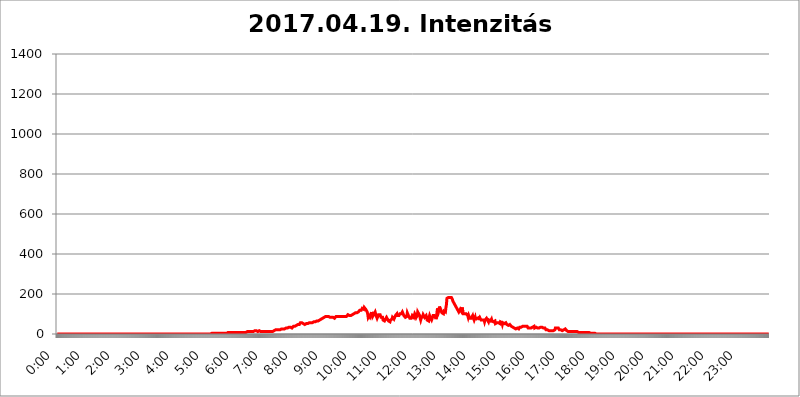
| Category | 2017.04.19. Intenzitás [W/m^2] |
|---|---|
| 0.0 | 0 |
| 0.0006944444444444445 | 0 |
| 0.001388888888888889 | 0 |
| 0.0020833333333333333 | 0 |
| 0.002777777777777778 | 0 |
| 0.003472222222222222 | 0 |
| 0.004166666666666667 | 0 |
| 0.004861111111111111 | 0 |
| 0.005555555555555556 | 0 |
| 0.0062499999999999995 | 0 |
| 0.006944444444444444 | 0 |
| 0.007638888888888889 | 0 |
| 0.008333333333333333 | 0 |
| 0.009027777777777779 | 0 |
| 0.009722222222222222 | 0 |
| 0.010416666666666666 | 0 |
| 0.011111111111111112 | 0 |
| 0.011805555555555555 | 0 |
| 0.012499999999999999 | 0 |
| 0.013194444444444444 | 0 |
| 0.013888888888888888 | 0 |
| 0.014583333333333332 | 0 |
| 0.015277777777777777 | 0 |
| 0.015972222222222224 | 0 |
| 0.016666666666666666 | 0 |
| 0.017361111111111112 | 0 |
| 0.018055555555555557 | 0 |
| 0.01875 | 0 |
| 0.019444444444444445 | 0 |
| 0.02013888888888889 | 0 |
| 0.020833333333333332 | 0 |
| 0.02152777777777778 | 0 |
| 0.022222222222222223 | 0 |
| 0.02291666666666667 | 0 |
| 0.02361111111111111 | 0 |
| 0.024305555555555556 | 0 |
| 0.024999999999999998 | 0 |
| 0.025694444444444447 | 0 |
| 0.02638888888888889 | 0 |
| 0.027083333333333334 | 0 |
| 0.027777777777777776 | 0 |
| 0.02847222222222222 | 0 |
| 0.029166666666666664 | 0 |
| 0.029861111111111113 | 0 |
| 0.030555555555555555 | 0 |
| 0.03125 | 0 |
| 0.03194444444444445 | 0 |
| 0.03263888888888889 | 0 |
| 0.03333333333333333 | 0 |
| 0.034027777777777775 | 0 |
| 0.034722222222222224 | 0 |
| 0.035416666666666666 | 0 |
| 0.036111111111111115 | 0 |
| 0.03680555555555556 | 0 |
| 0.0375 | 0 |
| 0.03819444444444444 | 0 |
| 0.03888888888888889 | 0 |
| 0.03958333333333333 | 0 |
| 0.04027777777777778 | 0 |
| 0.04097222222222222 | 0 |
| 0.041666666666666664 | 0 |
| 0.042361111111111106 | 0 |
| 0.04305555555555556 | 0 |
| 0.043750000000000004 | 0 |
| 0.044444444444444446 | 0 |
| 0.04513888888888889 | 0 |
| 0.04583333333333334 | 0 |
| 0.04652777777777778 | 0 |
| 0.04722222222222222 | 0 |
| 0.04791666666666666 | 0 |
| 0.04861111111111111 | 0 |
| 0.049305555555555554 | 0 |
| 0.049999999999999996 | 0 |
| 0.05069444444444445 | 0 |
| 0.051388888888888894 | 0 |
| 0.052083333333333336 | 0 |
| 0.05277777777777778 | 0 |
| 0.05347222222222222 | 0 |
| 0.05416666666666667 | 0 |
| 0.05486111111111111 | 0 |
| 0.05555555555555555 | 0 |
| 0.05625 | 0 |
| 0.05694444444444444 | 0 |
| 0.057638888888888885 | 0 |
| 0.05833333333333333 | 0 |
| 0.05902777777777778 | 0 |
| 0.059722222222222225 | 0 |
| 0.06041666666666667 | 0 |
| 0.061111111111111116 | 0 |
| 0.06180555555555556 | 0 |
| 0.0625 | 0 |
| 0.06319444444444444 | 0 |
| 0.06388888888888888 | 0 |
| 0.06458333333333334 | 0 |
| 0.06527777777777778 | 0 |
| 0.06597222222222222 | 0 |
| 0.06666666666666667 | 0 |
| 0.06736111111111111 | 0 |
| 0.06805555555555555 | 0 |
| 0.06874999999999999 | 0 |
| 0.06944444444444443 | 0 |
| 0.07013888888888889 | 0 |
| 0.07083333333333333 | 0 |
| 0.07152777777777779 | 0 |
| 0.07222222222222223 | 0 |
| 0.07291666666666667 | 0 |
| 0.07361111111111111 | 0 |
| 0.07430555555555556 | 0 |
| 0.075 | 0 |
| 0.07569444444444444 | 0 |
| 0.0763888888888889 | 0 |
| 0.07708333333333334 | 0 |
| 0.07777777777777778 | 0 |
| 0.07847222222222222 | 0 |
| 0.07916666666666666 | 0 |
| 0.0798611111111111 | 0 |
| 0.08055555555555556 | 0 |
| 0.08125 | 0 |
| 0.08194444444444444 | 0 |
| 0.08263888888888889 | 0 |
| 0.08333333333333333 | 0 |
| 0.08402777777777777 | 0 |
| 0.08472222222222221 | 0 |
| 0.08541666666666665 | 0 |
| 0.08611111111111112 | 0 |
| 0.08680555555555557 | 0 |
| 0.08750000000000001 | 0 |
| 0.08819444444444445 | 0 |
| 0.08888888888888889 | 0 |
| 0.08958333333333333 | 0 |
| 0.09027777777777778 | 0 |
| 0.09097222222222222 | 0 |
| 0.09166666666666667 | 0 |
| 0.09236111111111112 | 0 |
| 0.09305555555555556 | 0 |
| 0.09375 | 0 |
| 0.09444444444444444 | 0 |
| 0.09513888888888888 | 0 |
| 0.09583333333333333 | 0 |
| 0.09652777777777777 | 0 |
| 0.09722222222222222 | 0 |
| 0.09791666666666667 | 0 |
| 0.09861111111111111 | 0 |
| 0.09930555555555555 | 0 |
| 0.09999999999999999 | 0 |
| 0.10069444444444443 | 0 |
| 0.1013888888888889 | 0 |
| 0.10208333333333335 | 0 |
| 0.10277777777777779 | 0 |
| 0.10347222222222223 | 0 |
| 0.10416666666666667 | 0 |
| 0.10486111111111111 | 0 |
| 0.10555555555555556 | 0 |
| 0.10625 | 0 |
| 0.10694444444444444 | 0 |
| 0.1076388888888889 | 0 |
| 0.10833333333333334 | 0 |
| 0.10902777777777778 | 0 |
| 0.10972222222222222 | 0 |
| 0.1111111111111111 | 0 |
| 0.11180555555555556 | 0 |
| 0.11180555555555556 | 0 |
| 0.1125 | 0 |
| 0.11319444444444444 | 0 |
| 0.11388888888888889 | 0 |
| 0.11458333333333333 | 0 |
| 0.11527777777777777 | 0 |
| 0.11597222222222221 | 0 |
| 0.11666666666666665 | 0 |
| 0.1173611111111111 | 0 |
| 0.11805555555555557 | 0 |
| 0.11944444444444445 | 0 |
| 0.12013888888888889 | 0 |
| 0.12083333333333333 | 0 |
| 0.12152777777777778 | 0 |
| 0.12222222222222223 | 0 |
| 0.12291666666666667 | 0 |
| 0.12291666666666667 | 0 |
| 0.12361111111111112 | 0 |
| 0.12430555555555556 | 0 |
| 0.125 | 0 |
| 0.12569444444444444 | 0 |
| 0.12638888888888888 | 0 |
| 0.12708333333333333 | 0 |
| 0.16875 | 0 |
| 0.12847222222222224 | 0 |
| 0.12916666666666668 | 0 |
| 0.12986111111111112 | 0 |
| 0.13055555555555556 | 0 |
| 0.13125 | 0 |
| 0.13194444444444445 | 0 |
| 0.1326388888888889 | 0 |
| 0.13333333333333333 | 0 |
| 0.13402777777777777 | 0 |
| 0.13402777777777777 | 0 |
| 0.13472222222222222 | 0 |
| 0.13541666666666666 | 0 |
| 0.1361111111111111 | 0 |
| 0.13749999999999998 | 0 |
| 0.13819444444444443 | 0 |
| 0.1388888888888889 | 0 |
| 0.13958333333333334 | 0 |
| 0.14027777777777778 | 0 |
| 0.14097222222222222 | 0 |
| 0.14166666666666666 | 0 |
| 0.1423611111111111 | 0 |
| 0.14305555555555557 | 0 |
| 0.14375000000000002 | 0 |
| 0.14444444444444446 | 0 |
| 0.1451388888888889 | 0 |
| 0.1451388888888889 | 0 |
| 0.14652777777777778 | 0 |
| 0.14722222222222223 | 0 |
| 0.14791666666666667 | 0 |
| 0.1486111111111111 | 0 |
| 0.14930555555555555 | 0 |
| 0.15 | 0 |
| 0.15069444444444444 | 0 |
| 0.15138888888888888 | 0 |
| 0.15208333333333332 | 0 |
| 0.15277777777777776 | 0 |
| 0.15347222222222223 | 0 |
| 0.15416666666666667 | 0 |
| 0.15486111111111112 | 0 |
| 0.15555555555555556 | 0 |
| 0.15625 | 0 |
| 0.15694444444444444 | 0 |
| 0.15763888888888888 | 0 |
| 0.15833333333333333 | 0 |
| 0.15902777777777777 | 0 |
| 0.15972222222222224 | 0 |
| 0.16041666666666668 | 0 |
| 0.16111111111111112 | 0 |
| 0.16180555555555556 | 0 |
| 0.1625 | 0 |
| 0.16319444444444445 | 0 |
| 0.1638888888888889 | 0 |
| 0.16458333333333333 | 0 |
| 0.16527777777777777 | 0 |
| 0.16597222222222222 | 0 |
| 0.16666666666666666 | 0 |
| 0.1673611111111111 | 0 |
| 0.16805555555555554 | 0 |
| 0.16874999999999998 | 0 |
| 0.16944444444444443 | 0 |
| 0.17013888888888887 | 0 |
| 0.1708333333333333 | 0 |
| 0.17152777777777775 | 0 |
| 0.17222222222222225 | 0 |
| 0.1729166666666667 | 0 |
| 0.17361111111111113 | 0 |
| 0.17430555555555557 | 0 |
| 0.17500000000000002 | 0 |
| 0.17569444444444446 | 0 |
| 0.1763888888888889 | 0 |
| 0.17708333333333334 | 0 |
| 0.17777777777777778 | 0 |
| 0.17847222222222223 | 0 |
| 0.17916666666666667 | 0 |
| 0.1798611111111111 | 0 |
| 0.18055555555555555 | 0 |
| 0.18125 | 0 |
| 0.18194444444444444 | 0 |
| 0.1826388888888889 | 0 |
| 0.18333333333333335 | 0 |
| 0.1840277777777778 | 0 |
| 0.18472222222222223 | 0 |
| 0.18541666666666667 | 0 |
| 0.18611111111111112 | 0 |
| 0.18680555555555556 | 0 |
| 0.1875 | 0 |
| 0.18819444444444444 | 0 |
| 0.18888888888888888 | 0 |
| 0.18958333333333333 | 0 |
| 0.19027777777777777 | 0 |
| 0.1909722222222222 | 0 |
| 0.19166666666666665 | 0 |
| 0.19236111111111112 | 0 |
| 0.19305555555555554 | 0 |
| 0.19375 | 0 |
| 0.19444444444444445 | 0 |
| 0.1951388888888889 | 0 |
| 0.19583333333333333 | 0 |
| 0.19652777777777777 | 0 |
| 0.19722222222222222 | 0 |
| 0.19791666666666666 | 0 |
| 0.1986111111111111 | 0 |
| 0.19930555555555554 | 0 |
| 0.19999999999999998 | 0 |
| 0.20069444444444443 | 0 |
| 0.20138888888888887 | 0 |
| 0.2020833333333333 | 0 |
| 0.2027777777777778 | 0 |
| 0.2034722222222222 | 0 |
| 0.2041666666666667 | 0 |
| 0.20486111111111113 | 0 |
| 0.20555555555555557 | 0 |
| 0.20625000000000002 | 0 |
| 0.20694444444444446 | 0 |
| 0.2076388888888889 | 0 |
| 0.20833333333333334 | 0 |
| 0.20902777777777778 | 0 |
| 0.20972222222222223 | 0 |
| 0.21041666666666667 | 0 |
| 0.2111111111111111 | 0 |
| 0.21180555555555555 | 0 |
| 0.2125 | 0 |
| 0.21319444444444444 | 0 |
| 0.2138888888888889 | 0 |
| 0.21458333333333335 | 0 |
| 0.2152777777777778 | 0 |
| 0.21597222222222223 | 0 |
| 0.21666666666666667 | 3.525 |
| 0.21736111111111112 | 3.525 |
| 0.21805555555555556 | 3.525 |
| 0.21875 | 3.525 |
| 0.21944444444444444 | 3.525 |
| 0.22013888888888888 | 3.525 |
| 0.22083333333333333 | 3.525 |
| 0.22152777777777777 | 3.525 |
| 0.2222222222222222 | 3.525 |
| 0.22291666666666665 | 3.525 |
| 0.2236111111111111 | 3.525 |
| 0.22430555555555556 | 3.525 |
| 0.225 | 3.525 |
| 0.22569444444444445 | 3.525 |
| 0.2263888888888889 | 3.525 |
| 0.22708333333333333 | 3.525 |
| 0.22777777777777777 | 3.525 |
| 0.22847222222222222 | 3.525 |
| 0.22916666666666666 | 3.525 |
| 0.2298611111111111 | 3.525 |
| 0.23055555555555554 | 3.525 |
| 0.23124999999999998 | 3.525 |
| 0.23194444444444443 | 3.525 |
| 0.23263888888888887 | 3.525 |
| 0.2333333333333333 | 3.525 |
| 0.2340277777777778 | 3.525 |
| 0.2347222222222222 | 3.525 |
| 0.2354166666666667 | 3.525 |
| 0.23611111111111113 | 3.525 |
| 0.23680555555555557 | 3.525 |
| 0.23750000000000002 | 3.525 |
| 0.23819444444444446 | 7.887 |
| 0.2388888888888889 | 3.525 |
| 0.23958333333333334 | 7.887 |
| 0.24027777777777778 | 7.887 |
| 0.24097222222222223 | 7.887 |
| 0.24166666666666667 | 7.887 |
| 0.2423611111111111 | 7.887 |
| 0.24305555555555555 | 7.887 |
| 0.24375 | 7.887 |
| 0.24444444444444446 | 7.887 |
| 0.24513888888888888 | 7.887 |
| 0.24583333333333335 | 7.887 |
| 0.2465277777777778 | 7.887 |
| 0.24722222222222223 | 7.887 |
| 0.24791666666666667 | 7.887 |
| 0.24861111111111112 | 7.887 |
| 0.24930555555555556 | 3.525 |
| 0.25 | 7.887 |
| 0.25069444444444444 | 7.887 |
| 0.2513888888888889 | 7.887 |
| 0.2520833333333333 | 7.887 |
| 0.25277777777777777 | 7.887 |
| 0.2534722222222222 | 7.887 |
| 0.25416666666666665 | 7.887 |
| 0.2548611111111111 | 7.887 |
| 0.2555555555555556 | 7.887 |
| 0.25625000000000003 | 7.887 |
| 0.2569444444444445 | 7.887 |
| 0.2576388888888889 | 7.887 |
| 0.25833333333333336 | 7.887 |
| 0.2590277777777778 | 12.257 |
| 0.25972222222222224 | 12.257 |
| 0.2604166666666667 | 7.887 |
| 0.2611111111111111 | 12.257 |
| 0.26180555555555557 | 7.887 |
| 0.2625 | 7.887 |
| 0.26319444444444445 | 7.887 |
| 0.2638888888888889 | 7.887 |
| 0.26458333333333334 | 7.887 |
| 0.2652777777777778 | 7.887 |
| 0.2659722222222222 | 7.887 |
| 0.26666666666666666 | 12.257 |
| 0.2673611111111111 | 12.257 |
| 0.26805555555555555 | 12.257 |
| 0.26875 | 12.257 |
| 0.26944444444444443 | 12.257 |
| 0.2701388888888889 | 12.257 |
| 0.2708333333333333 | 12.257 |
| 0.27152777777777776 | 12.257 |
| 0.2722222222222222 | 12.257 |
| 0.27291666666666664 | 12.257 |
| 0.2736111111111111 | 12.257 |
| 0.2743055555555555 | 12.257 |
| 0.27499999999999997 | 12.257 |
| 0.27569444444444446 | 12.257 |
| 0.27638888888888885 | 12.257 |
| 0.27708333333333335 | 16.636 |
| 0.2777777777777778 | 12.257 |
| 0.27847222222222223 | 16.636 |
| 0.2791666666666667 | 16.636 |
| 0.2798611111111111 | 16.636 |
| 0.28055555555555556 | 16.636 |
| 0.28125 | 12.257 |
| 0.28194444444444444 | 16.636 |
| 0.2826388888888889 | 12.257 |
| 0.2833333333333333 | 16.636 |
| 0.28402777777777777 | 16.636 |
| 0.2847222222222222 | 12.257 |
| 0.28541666666666665 | 12.257 |
| 0.28611111111111115 | 12.257 |
| 0.28680555555555554 | 12.257 |
| 0.28750000000000003 | 12.257 |
| 0.2881944444444445 | 12.257 |
| 0.2888888888888889 | 12.257 |
| 0.28958333333333336 | 12.257 |
| 0.2902777777777778 | 12.257 |
| 0.29097222222222224 | 12.257 |
| 0.2916666666666667 | 12.257 |
| 0.2923611111111111 | 12.257 |
| 0.29305555555555557 | 12.257 |
| 0.29375 | 12.257 |
| 0.29444444444444445 | 12.257 |
| 0.2951388888888889 | 12.257 |
| 0.29583333333333334 | 12.257 |
| 0.2965277777777778 | 12.257 |
| 0.2972222222222222 | 12.257 |
| 0.29791666666666666 | 12.257 |
| 0.2986111111111111 | 12.257 |
| 0.29930555555555555 | 12.257 |
| 0.3 | 12.257 |
| 0.30069444444444443 | 12.257 |
| 0.3013888888888889 | 12.257 |
| 0.3020833333333333 | 12.257 |
| 0.30277777777777776 | 12.257 |
| 0.3034722222222222 | 12.257 |
| 0.30416666666666664 | 16.636 |
| 0.3048611111111111 | 16.636 |
| 0.3055555555555555 | 16.636 |
| 0.30624999999999997 | 21.024 |
| 0.3069444444444444 | 21.024 |
| 0.3076388888888889 | 21.024 |
| 0.30833333333333335 | 21.024 |
| 0.3090277777777778 | 21.024 |
| 0.30972222222222223 | 21.024 |
| 0.3104166666666667 | 21.024 |
| 0.3111111111111111 | 21.024 |
| 0.31180555555555556 | 21.024 |
| 0.3125 | 21.024 |
| 0.31319444444444444 | 21.024 |
| 0.3138888888888889 | 21.024 |
| 0.3145833333333333 | 25.419 |
| 0.31527777777777777 | 25.419 |
| 0.3159722222222222 | 25.419 |
| 0.31666666666666665 | 25.419 |
| 0.31736111111111115 | 25.419 |
| 0.31805555555555554 | 25.419 |
| 0.31875000000000003 | 25.419 |
| 0.3194444444444445 | 29.823 |
| 0.3201388888888889 | 29.823 |
| 0.32083333333333336 | 29.823 |
| 0.3215277777777778 | 29.823 |
| 0.32222222222222224 | 29.823 |
| 0.3229166666666667 | 29.823 |
| 0.3236111111111111 | 29.823 |
| 0.32430555555555557 | 34.234 |
| 0.325 | 34.234 |
| 0.32569444444444445 | 34.234 |
| 0.3263888888888889 | 34.234 |
| 0.32708333333333334 | 34.234 |
| 0.3277777777777778 | 34.234 |
| 0.3284722222222222 | 34.234 |
| 0.32916666666666666 | 29.823 |
| 0.3298611111111111 | 34.234 |
| 0.33055555555555555 | 34.234 |
| 0.33125 | 38.653 |
| 0.33194444444444443 | 38.653 |
| 0.3326388888888889 | 38.653 |
| 0.3333333333333333 | 38.653 |
| 0.3340277777777778 | 38.653 |
| 0.3347222222222222 | 43.079 |
| 0.3354166666666667 | 43.079 |
| 0.3361111111111111 | 43.079 |
| 0.3368055555555556 | 47.511 |
| 0.33749999999999997 | 47.511 |
| 0.33819444444444446 | 47.511 |
| 0.33888888888888885 | 47.511 |
| 0.33958333333333335 | 47.511 |
| 0.34027777777777773 | 51.951 |
| 0.34097222222222223 | 56.398 |
| 0.3416666666666666 | 51.951 |
| 0.3423611111111111 | 56.398 |
| 0.3430555555555555 | 56.398 |
| 0.34375 | 51.951 |
| 0.3444444444444445 | 51.951 |
| 0.3451388888888889 | 51.951 |
| 0.3458333333333334 | 56.398 |
| 0.34652777777777777 | 47.511 |
| 0.34722222222222227 | 47.511 |
| 0.34791666666666665 | 51.951 |
| 0.34861111111111115 | 51.951 |
| 0.34930555555555554 | 51.951 |
| 0.35000000000000003 | 56.398 |
| 0.3506944444444444 | 51.951 |
| 0.3513888888888889 | 51.951 |
| 0.3520833333333333 | 56.398 |
| 0.3527777777777778 | 51.951 |
| 0.3534722222222222 | 56.398 |
| 0.3541666666666667 | 56.398 |
| 0.3548611111111111 | 51.951 |
| 0.35555555555555557 | 56.398 |
| 0.35625 | 56.398 |
| 0.35694444444444445 | 51.951 |
| 0.3576388888888889 | 56.398 |
| 0.35833333333333334 | 56.398 |
| 0.3590277777777778 | 60.85 |
| 0.3597222222222222 | 60.85 |
| 0.36041666666666666 | 60.85 |
| 0.3611111111111111 | 65.31 |
| 0.36180555555555555 | 60.85 |
| 0.3625 | 60.85 |
| 0.36319444444444443 | 65.31 |
| 0.3638888888888889 | 65.31 |
| 0.3645833333333333 | 60.85 |
| 0.3652777777777778 | 65.31 |
| 0.3659722222222222 | 65.31 |
| 0.3666666666666667 | 65.31 |
| 0.3673611111111111 | 65.31 |
| 0.3680555555555556 | 69.775 |
| 0.36874999999999997 | 69.775 |
| 0.36944444444444446 | 74.246 |
| 0.37013888888888885 | 74.246 |
| 0.37083333333333335 | 74.246 |
| 0.37152777777777773 | 74.246 |
| 0.37222222222222223 | 78.722 |
| 0.3729166666666666 | 78.722 |
| 0.3736111111111111 | 78.722 |
| 0.3743055555555555 | 83.205 |
| 0.375 | 78.722 |
| 0.3756944444444445 | 83.205 |
| 0.3763888888888889 | 87.692 |
| 0.3770833333333334 | 87.692 |
| 0.37777777777777777 | 83.205 |
| 0.37847222222222227 | 87.692 |
| 0.37916666666666665 | 83.205 |
| 0.37986111111111115 | 83.205 |
| 0.38055555555555554 | 87.692 |
| 0.38125000000000003 | 87.692 |
| 0.3819444444444444 | 87.692 |
| 0.3826388888888889 | 83.205 |
| 0.3833333333333333 | 83.205 |
| 0.3840277777777778 | 83.205 |
| 0.3847222222222222 | 83.205 |
| 0.3854166666666667 | 83.205 |
| 0.3861111111111111 | 83.205 |
| 0.38680555555555557 | 83.205 |
| 0.3875 | 83.205 |
| 0.38819444444444445 | 83.205 |
| 0.3888888888888889 | 78.722 |
| 0.38958333333333334 | 83.205 |
| 0.3902777777777778 | 83.205 |
| 0.3909722222222222 | 87.692 |
| 0.39166666666666666 | 87.692 |
| 0.3923611111111111 | 87.692 |
| 0.39305555555555555 | 87.692 |
| 0.39375 | 92.184 |
| 0.39444444444444443 | 87.692 |
| 0.3951388888888889 | 87.692 |
| 0.3958333333333333 | 87.692 |
| 0.3965277777777778 | 87.692 |
| 0.3972222222222222 | 87.692 |
| 0.3979166666666667 | 83.205 |
| 0.3986111111111111 | 83.205 |
| 0.3993055555555556 | 87.692 |
| 0.39999999999999997 | 87.692 |
| 0.40069444444444446 | 87.692 |
| 0.40138888888888885 | 87.692 |
| 0.40208333333333335 | 87.692 |
| 0.40277777777777773 | 87.692 |
| 0.40347222222222223 | 87.692 |
| 0.4041666666666666 | 87.692 |
| 0.4048611111111111 | 87.692 |
| 0.4055555555555555 | 87.692 |
| 0.40625 | 92.184 |
| 0.4069444444444445 | 92.184 |
| 0.4076388888888889 | 96.682 |
| 0.4083333333333334 | 92.184 |
| 0.40902777777777777 | 92.184 |
| 0.40972222222222227 | 92.184 |
| 0.41041666666666665 | 92.184 |
| 0.41111111111111115 | 92.184 |
| 0.41180555555555554 | 92.184 |
| 0.41250000000000003 | 92.184 |
| 0.4131944444444444 | 92.184 |
| 0.4138888888888889 | 96.682 |
| 0.4145833333333333 | 101.184 |
| 0.4152777777777778 | 96.682 |
| 0.4159722222222222 | 101.184 |
| 0.4166666666666667 | 105.69 |
| 0.4173611111111111 | 105.69 |
| 0.41805555555555557 | 105.69 |
| 0.41875 | 101.184 |
| 0.41944444444444445 | 105.69 |
| 0.4201388888888889 | 105.69 |
| 0.42083333333333334 | 110.201 |
| 0.4215277777777778 | 110.201 |
| 0.4222222222222222 | 110.201 |
| 0.42291666666666666 | 110.201 |
| 0.4236111111111111 | 110.201 |
| 0.42430555555555555 | 119.235 |
| 0.425 | 123.758 |
| 0.42569444444444443 | 114.716 |
| 0.4263888888888889 | 119.235 |
| 0.4270833333333333 | 123.758 |
| 0.4277777777777778 | 128.284 |
| 0.4284722222222222 | 128.284 |
| 0.4291666666666667 | 123.758 |
| 0.4298611111111111 | 123.758 |
| 0.4305555555555556 | 132.814 |
| 0.43124999999999997 | 128.284 |
| 0.43194444444444446 | 128.284 |
| 0.43263888888888885 | 123.758 |
| 0.43333333333333335 | 119.235 |
| 0.43402777777777773 | 119.235 |
| 0.43472222222222223 | 110.201 |
| 0.4354166666666666 | 101.184 |
| 0.4361111111111111 | 83.205 |
| 0.4368055555555555 | 83.205 |
| 0.4375 | 92.184 |
| 0.4381944444444445 | 92.184 |
| 0.4388888888888889 | 83.205 |
| 0.4395833333333334 | 83.205 |
| 0.44027777777777777 | 92.184 |
| 0.44097222222222227 | 110.201 |
| 0.44166666666666665 | 101.184 |
| 0.44236111111111115 | 87.692 |
| 0.44305555555555554 | 87.692 |
| 0.44375000000000003 | 92.184 |
| 0.4444444444444444 | 101.184 |
| 0.4451388888888889 | 105.69 |
| 0.4458333333333333 | 110.201 |
| 0.4465277777777778 | 110.201 |
| 0.4472222222222222 | 92.184 |
| 0.4479166666666667 | 87.692 |
| 0.4486111111111111 | 78.722 |
| 0.44930555555555557 | 78.722 |
| 0.45 | 83.205 |
| 0.45069444444444445 | 96.682 |
| 0.4513888888888889 | 101.184 |
| 0.45208333333333334 | 101.184 |
| 0.4527777777777778 | 96.682 |
| 0.4534722222222222 | 96.682 |
| 0.45416666666666666 | 83.205 |
| 0.4548611111111111 | 78.722 |
| 0.45555555555555555 | 78.722 |
| 0.45625 | 83.205 |
| 0.45694444444444443 | 69.775 |
| 0.4576388888888889 | 65.31 |
| 0.4583333333333333 | 65.31 |
| 0.4590277777777778 | 65.31 |
| 0.4597222222222222 | 65.31 |
| 0.4604166666666667 | 74.246 |
| 0.4611111111111111 | 78.722 |
| 0.4618055555555556 | 83.205 |
| 0.46249999999999997 | 83.205 |
| 0.46319444444444446 | 74.246 |
| 0.46388888888888885 | 69.775 |
| 0.46458333333333335 | 65.31 |
| 0.46527777777777773 | 65.31 |
| 0.46597222222222223 | 65.31 |
| 0.4666666666666666 | 60.85 |
| 0.4673611111111111 | 69.775 |
| 0.4680555555555555 | 65.31 |
| 0.46875 | 69.775 |
| 0.4694444444444445 | 74.246 |
| 0.4701388888888889 | 83.205 |
| 0.4708333333333334 | 78.722 |
| 0.47152777777777777 | 78.722 |
| 0.47222222222222227 | 74.246 |
| 0.47291666666666665 | 78.722 |
| 0.47361111111111115 | 78.722 |
| 0.47430555555555554 | 92.184 |
| 0.47500000000000003 | 92.184 |
| 0.4756944444444444 | 96.682 |
| 0.4763888888888889 | 101.184 |
| 0.4770833333333333 | 92.184 |
| 0.4777777777777778 | 96.682 |
| 0.4784722222222222 | 87.692 |
| 0.4791666666666667 | 92.184 |
| 0.4798611111111111 | 96.682 |
| 0.48055555555555557 | 101.184 |
| 0.48125 | 101.184 |
| 0.48194444444444445 | 101.184 |
| 0.4826388888888889 | 101.184 |
| 0.48333333333333334 | 101.184 |
| 0.4840277777777778 | 110.201 |
| 0.4847222222222222 | 105.69 |
| 0.48541666666666666 | 105.69 |
| 0.4861111111111111 | 92.184 |
| 0.48680555555555555 | 87.692 |
| 0.4875 | 87.692 |
| 0.48819444444444443 | 83.205 |
| 0.4888888888888889 | 83.205 |
| 0.4895833333333333 | 83.205 |
| 0.4902777777777778 | 87.692 |
| 0.4909722222222222 | 105.69 |
| 0.4916666666666667 | 105.69 |
| 0.4923611111111111 | 101.184 |
| 0.4930555555555556 | 87.692 |
| 0.49374999999999997 | 83.205 |
| 0.49444444444444446 | 78.722 |
| 0.49513888888888885 | 78.722 |
| 0.49583333333333335 | 83.205 |
| 0.49652777777777773 | 78.722 |
| 0.49722222222222223 | 74.246 |
| 0.4979166666666666 | 92.184 |
| 0.4986111111111111 | 96.682 |
| 0.4993055555555555 | 92.184 |
| 0.5 | 83.205 |
| 0.5006944444444444 | 92.184 |
| 0.5013888888888889 | 101.184 |
| 0.5020833333333333 | 96.682 |
| 0.5027777777777778 | 92.184 |
| 0.5034722222222222 | 83.205 |
| 0.5041666666666667 | 83.205 |
| 0.5048611111111111 | 92.184 |
| 0.5055555555555555 | 110.201 |
| 0.50625 | 110.201 |
| 0.5069444444444444 | 101.184 |
| 0.5076388888888889 | 101.184 |
| 0.5083333333333333 | 92.184 |
| 0.5090277777777777 | 78.722 |
| 0.5097222222222222 | 69.775 |
| 0.5104166666666666 | 78.722 |
| 0.5111111111111112 | 74.246 |
| 0.5118055555555555 | 83.205 |
| 0.5125000000000001 | 87.692 |
| 0.5131944444444444 | 96.682 |
| 0.513888888888889 | 92.184 |
| 0.5145833333333333 | 92.184 |
| 0.5152777777777778 | 83.205 |
| 0.5159722222222222 | 87.692 |
| 0.5166666666666667 | 83.205 |
| 0.517361111111111 | 92.184 |
| 0.5180555555555556 | 83.205 |
| 0.5187499999999999 | 69.775 |
| 0.5194444444444445 | 74.246 |
| 0.5201388888888888 | 74.246 |
| 0.5208333333333334 | 65.31 |
| 0.5215277777777778 | 83.205 |
| 0.5222222222222223 | 92.184 |
| 0.5229166666666667 | 87.692 |
| 0.5236111111111111 | 78.722 |
| 0.5243055555555556 | 74.246 |
| 0.525 | 69.775 |
| 0.5256944444444445 | 65.31 |
| 0.5263888888888889 | 83.205 |
| 0.5270833333333333 | 92.184 |
| 0.5277777777777778 | 92.184 |
| 0.5284722222222222 | 96.682 |
| 0.5291666666666667 | 92.184 |
| 0.5298611111111111 | 96.682 |
| 0.5305555555555556 | 83.205 |
| 0.53125 | 74.246 |
| 0.5319444444444444 | 87.692 |
| 0.5326388888888889 | 110.201 |
| 0.5333333333333333 | 128.284 |
| 0.5340277777777778 | 119.235 |
| 0.5347222222222222 | 110.201 |
| 0.5354166666666667 | 119.235 |
| 0.5361111111111111 | 137.347 |
| 0.5368055555555555 | 141.884 |
| 0.5375 | 132.814 |
| 0.5381944444444444 | 114.716 |
| 0.5388888888888889 | 110.201 |
| 0.5395833333333333 | 105.69 |
| 0.5402777777777777 | 110.201 |
| 0.5409722222222222 | 110.201 |
| 0.5416666666666666 | 101.184 |
| 0.5423611111111112 | 114.716 |
| 0.5430555555555555 | 119.235 |
| 0.5437500000000001 | 114.716 |
| 0.5444444444444444 | 110.201 |
| 0.545138888888889 | 132.814 |
| 0.5458333333333333 | 146.423 |
| 0.5465277777777778 | 178.264 |
| 0.5472222222222222 | 182.82 |
| 0.5479166666666667 | 182.82 |
| 0.548611111111111 | 182.82 |
| 0.5493055555555556 | 182.82 |
| 0.5499999999999999 | 182.82 |
| 0.5506944444444445 | 182.82 |
| 0.5513888888888888 | 182.82 |
| 0.5520833333333334 | 182.82 |
| 0.5527777777777778 | 182.82 |
| 0.5534722222222223 | 182.82 |
| 0.5541666666666667 | 173.709 |
| 0.5548611111111111 | 164.605 |
| 0.5555555555555556 | 160.056 |
| 0.55625 | 155.509 |
| 0.5569444444444445 | 150.964 |
| 0.5576388888888889 | 146.423 |
| 0.5583333333333333 | 141.884 |
| 0.5590277777777778 | 137.347 |
| 0.5597222222222222 | 132.814 |
| 0.5604166666666667 | 128.284 |
| 0.5611111111111111 | 123.758 |
| 0.5618055555555556 | 119.235 |
| 0.5625 | 114.716 |
| 0.5631944444444444 | 110.201 |
| 0.5638888888888889 | 105.69 |
| 0.5645833333333333 | 110.201 |
| 0.5652777777777778 | 123.758 |
| 0.5659722222222222 | 123.758 |
| 0.5666666666666667 | 114.716 |
| 0.5673611111111111 | 114.716 |
| 0.5680555555555555 | 132.814 |
| 0.56875 | 114.716 |
| 0.5694444444444444 | 101.184 |
| 0.5701388888888889 | 105.69 |
| 0.5708333333333333 | 96.682 |
| 0.5715277777777777 | 101.184 |
| 0.5722222222222222 | 101.184 |
| 0.5729166666666666 | 101.184 |
| 0.5736111111111112 | 101.184 |
| 0.5743055555555555 | 105.69 |
| 0.5750000000000001 | 101.184 |
| 0.5756944444444444 | 92.184 |
| 0.576388888888889 | 83.205 |
| 0.5770833333333333 | 92.184 |
| 0.5777777777777778 | 92.184 |
| 0.5784722222222222 | 78.722 |
| 0.5791666666666667 | 83.205 |
| 0.579861111111111 | 78.722 |
| 0.5805555555555556 | 78.722 |
| 0.5812499999999999 | 78.722 |
| 0.5819444444444445 | 83.205 |
| 0.5826388888888888 | 92.184 |
| 0.5833333333333334 | 83.205 |
| 0.5840277777777778 | 78.722 |
| 0.5847222222222223 | 69.775 |
| 0.5854166666666667 | 65.31 |
| 0.5861111111111111 | 83.205 |
| 0.5868055555555556 | 69.775 |
| 0.5875 | 78.722 |
| 0.5881944444444445 | 78.722 |
| 0.5888888888888889 | 83.205 |
| 0.5895833333333333 | 78.722 |
| 0.5902777777777778 | 83.205 |
| 0.5909722222222222 | 78.722 |
| 0.5916666666666667 | 83.205 |
| 0.5923611111111111 | 69.775 |
| 0.5930555555555556 | 78.722 |
| 0.59375 | 83.205 |
| 0.5944444444444444 | 69.775 |
| 0.5951388888888889 | 65.31 |
| 0.5958333333333333 | 74.246 |
| 0.5965277777777778 | 69.775 |
| 0.5972222222222222 | 69.775 |
| 0.5979166666666667 | 74.246 |
| 0.5986111111111111 | 69.775 |
| 0.5993055555555555 | 60.85 |
| 0.6 | 69.775 |
| 0.6006944444444444 | 69.775 |
| 0.6013888888888889 | 74.246 |
| 0.6020833333333333 | 78.722 |
| 0.6027777777777777 | 74.246 |
| 0.6034722222222222 | 69.775 |
| 0.6041666666666666 | 65.31 |
| 0.6048611111111112 | 60.85 |
| 0.6055555555555555 | 69.775 |
| 0.6062500000000001 | 74.246 |
| 0.6069444444444444 | 74.246 |
| 0.607638888888889 | 65.31 |
| 0.6083333333333333 | 60.85 |
| 0.6090277777777778 | 74.246 |
| 0.6097222222222222 | 65.31 |
| 0.6104166666666667 | 60.85 |
| 0.611111111111111 | 60.85 |
| 0.6118055555555556 | 60.85 |
| 0.6124999999999999 | 56.398 |
| 0.6131944444444445 | 60.85 |
| 0.6138888888888888 | 65.31 |
| 0.6145833333333334 | 51.951 |
| 0.6152777777777778 | 56.398 |
| 0.6159722222222223 | 56.398 |
| 0.6166666666666667 | 56.398 |
| 0.6173611111111111 | 56.398 |
| 0.6180555555555556 | 51.951 |
| 0.61875 | 56.398 |
| 0.6194444444444445 | 56.398 |
| 0.6201388888888889 | 56.398 |
| 0.6208333333333333 | 51.951 |
| 0.6215277777777778 | 60.85 |
| 0.6222222222222222 | 56.398 |
| 0.6229166666666667 | 56.398 |
| 0.6236111111111111 | 56.398 |
| 0.6243055555555556 | 47.511 |
| 0.625 | 56.398 |
| 0.6256944444444444 | 56.398 |
| 0.6263888888888889 | 51.951 |
| 0.6270833333333333 | 51.951 |
| 0.6277777777777778 | 56.398 |
| 0.6284722222222222 | 51.951 |
| 0.6291666666666667 | 56.398 |
| 0.6298611111111111 | 56.398 |
| 0.6305555555555555 | 47.511 |
| 0.63125 | 51.951 |
| 0.6319444444444444 | 51.951 |
| 0.6326388888888889 | 43.079 |
| 0.6333333333333333 | 43.079 |
| 0.6340277777777777 | 47.511 |
| 0.6347222222222222 | 47.511 |
| 0.6354166666666666 | 47.511 |
| 0.6361111111111112 | 47.511 |
| 0.6368055555555555 | 38.653 |
| 0.6375000000000001 | 34.234 |
| 0.6381944444444444 | 38.653 |
| 0.638888888888889 | 34.234 |
| 0.6395833333333333 | 34.234 |
| 0.6402777777777778 | 38.653 |
| 0.6409722222222222 | 29.823 |
| 0.6416666666666667 | 29.823 |
| 0.642361111111111 | 29.823 |
| 0.6430555555555556 | 25.419 |
| 0.6437499999999999 | 25.419 |
| 0.6444444444444445 | 29.823 |
| 0.6451388888888888 | 29.823 |
| 0.6458333333333334 | 29.823 |
| 0.6465277777777778 | 34.234 |
| 0.6472222222222223 | 25.419 |
| 0.6479166666666667 | 29.823 |
| 0.6486111111111111 | 34.234 |
| 0.6493055555555556 | 34.234 |
| 0.65 | 34.234 |
| 0.6506944444444445 | 34.234 |
| 0.6513888888888889 | 38.653 |
| 0.6520833333333333 | 34.234 |
| 0.6527777777777778 | 38.653 |
| 0.6534722222222222 | 34.234 |
| 0.6541666666666667 | 38.653 |
| 0.6548611111111111 | 38.653 |
| 0.6555555555555556 | 34.234 |
| 0.65625 | 34.234 |
| 0.6569444444444444 | 38.653 |
| 0.6576388888888889 | 38.653 |
| 0.6583333333333333 | 38.653 |
| 0.6590277777777778 | 38.653 |
| 0.6597222222222222 | 34.234 |
| 0.6604166666666667 | 29.823 |
| 0.6611111111111111 | 34.234 |
| 0.6618055555555555 | 34.234 |
| 0.6625 | 29.823 |
| 0.6631944444444444 | 29.823 |
| 0.6638888888888889 | 34.234 |
| 0.6645833333333333 | 29.823 |
| 0.6652777777777777 | 29.823 |
| 0.6659722222222222 | 29.823 |
| 0.6666666666666666 | 34.234 |
| 0.6673611111111111 | 34.234 |
| 0.6680555555555556 | 38.653 |
| 0.6687500000000001 | 38.653 |
| 0.6694444444444444 | 29.823 |
| 0.6701388888888888 | 34.234 |
| 0.6708333333333334 | 34.234 |
| 0.6715277777777778 | 34.234 |
| 0.6722222222222222 | 29.823 |
| 0.6729166666666666 | 29.823 |
| 0.6736111111111112 | 29.823 |
| 0.6743055555555556 | 29.823 |
| 0.6749999999999999 | 29.823 |
| 0.6756944444444444 | 29.823 |
| 0.6763888888888889 | 34.234 |
| 0.6770833333333334 | 34.234 |
| 0.6777777777777777 | 34.234 |
| 0.6784722222222223 | 34.234 |
| 0.6791666666666667 | 34.234 |
| 0.6798611111111111 | 34.234 |
| 0.6805555555555555 | 34.234 |
| 0.68125 | 29.823 |
| 0.6819444444444445 | 29.823 |
| 0.6826388888888889 | 29.823 |
| 0.6833333333333332 | 29.823 |
| 0.6840277777777778 | 29.823 |
| 0.6847222222222222 | 25.419 |
| 0.6854166666666667 | 21.024 |
| 0.686111111111111 | 25.419 |
| 0.6868055555555556 | 21.024 |
| 0.6875 | 21.024 |
| 0.6881944444444444 | 21.024 |
| 0.688888888888889 | 21.024 |
| 0.6895833333333333 | 16.636 |
| 0.6902777777777778 | 21.024 |
| 0.6909722222222222 | 21.024 |
| 0.6916666666666668 | 16.636 |
| 0.6923611111111111 | 16.636 |
| 0.6930555555555555 | 16.636 |
| 0.69375 | 16.636 |
| 0.6944444444444445 | 16.636 |
| 0.6951388888888889 | 16.636 |
| 0.6958333333333333 | 16.636 |
| 0.6965277777777777 | 16.636 |
| 0.6972222222222223 | 21.024 |
| 0.6979166666666666 | 21.024 |
| 0.6986111111111111 | 29.823 |
| 0.6993055555555556 | 29.823 |
| 0.7000000000000001 | 29.823 |
| 0.7006944444444444 | 29.823 |
| 0.7013888888888888 | 29.823 |
| 0.7020833333333334 | 29.823 |
| 0.7027777777777778 | 29.823 |
| 0.7034722222222222 | 25.419 |
| 0.7041666666666666 | 21.024 |
| 0.7048611111111112 | 21.024 |
| 0.7055555555555556 | 21.024 |
| 0.7062499999999999 | 21.024 |
| 0.7069444444444444 | 21.024 |
| 0.7076388888888889 | 21.024 |
| 0.7083333333333334 | 16.636 |
| 0.7090277777777777 | 16.636 |
| 0.7097222222222223 | 21.024 |
| 0.7104166666666667 | 21.024 |
| 0.7111111111111111 | 21.024 |
| 0.7118055555555555 | 25.419 |
| 0.7125 | 25.419 |
| 0.7131944444444445 | 21.024 |
| 0.7138888888888889 | 21.024 |
| 0.7145833333333332 | 16.636 |
| 0.7152777777777778 | 16.636 |
| 0.7159722222222222 | 16.636 |
| 0.7166666666666667 | 12.257 |
| 0.717361111111111 | 16.636 |
| 0.7180555555555556 | 12.257 |
| 0.71875 | 12.257 |
| 0.7194444444444444 | 12.257 |
| 0.720138888888889 | 12.257 |
| 0.7208333333333333 | 12.257 |
| 0.7215277777777778 | 12.257 |
| 0.7222222222222222 | 12.257 |
| 0.7229166666666668 | 12.257 |
| 0.7236111111111111 | 12.257 |
| 0.7243055555555555 | 12.257 |
| 0.725 | 12.257 |
| 0.7256944444444445 | 12.257 |
| 0.7263888888888889 | 12.257 |
| 0.7270833333333333 | 12.257 |
| 0.7277777777777777 | 12.257 |
| 0.7284722222222223 | 12.257 |
| 0.7291666666666666 | 12.257 |
| 0.7298611111111111 | 12.257 |
| 0.7305555555555556 | 12.257 |
| 0.7312500000000001 | 7.887 |
| 0.7319444444444444 | 12.257 |
| 0.7326388888888888 | 7.887 |
| 0.7333333333333334 | 7.887 |
| 0.7340277777777778 | 7.887 |
| 0.7347222222222222 | 7.887 |
| 0.7354166666666666 | 7.887 |
| 0.7361111111111112 | 7.887 |
| 0.7368055555555556 | 7.887 |
| 0.7374999999999999 | 7.887 |
| 0.7381944444444444 | 7.887 |
| 0.7388888888888889 | 7.887 |
| 0.7395833333333334 | 7.887 |
| 0.7402777777777777 | 7.887 |
| 0.7409722222222223 | 7.887 |
| 0.7416666666666667 | 7.887 |
| 0.7423611111111111 | 7.887 |
| 0.7430555555555555 | 7.887 |
| 0.74375 | 7.887 |
| 0.7444444444444445 | 7.887 |
| 0.7451388888888889 | 3.525 |
| 0.7458333333333332 | 7.887 |
| 0.7465277777777778 | 3.525 |
| 0.7472222222222222 | 7.887 |
| 0.7479166666666667 | 3.525 |
| 0.748611111111111 | 7.887 |
| 0.7493055555555556 | 3.525 |
| 0.75 | 3.525 |
| 0.7506944444444444 | 3.525 |
| 0.751388888888889 | 3.525 |
| 0.7520833333333333 | 3.525 |
| 0.7527777777777778 | 3.525 |
| 0.7534722222222222 | 3.525 |
| 0.7541666666666668 | 3.525 |
| 0.7548611111111111 | 3.525 |
| 0.7555555555555555 | 0 |
| 0.75625 | 0 |
| 0.7569444444444445 | 0 |
| 0.7576388888888889 | 0 |
| 0.7583333333333333 | 0 |
| 0.7590277777777777 | 0 |
| 0.7597222222222223 | 0 |
| 0.7604166666666666 | 0 |
| 0.7611111111111111 | 0 |
| 0.7618055555555556 | 0 |
| 0.7625000000000001 | 0 |
| 0.7631944444444444 | 0 |
| 0.7638888888888888 | 0 |
| 0.7645833333333334 | 0 |
| 0.7652777777777778 | 0 |
| 0.7659722222222222 | 0 |
| 0.7666666666666666 | 0 |
| 0.7673611111111112 | 0 |
| 0.7680555555555556 | 0 |
| 0.7687499999999999 | 0 |
| 0.7694444444444444 | 0 |
| 0.7701388888888889 | 0 |
| 0.7708333333333334 | 0 |
| 0.7715277777777777 | 0 |
| 0.7722222222222223 | 0 |
| 0.7729166666666667 | 0 |
| 0.7736111111111111 | 0 |
| 0.7743055555555555 | 0 |
| 0.775 | 0 |
| 0.7756944444444445 | 0 |
| 0.7763888888888889 | 0 |
| 0.7770833333333332 | 0 |
| 0.7777777777777778 | 0 |
| 0.7784722222222222 | 0 |
| 0.7791666666666667 | 0 |
| 0.779861111111111 | 0 |
| 0.7805555555555556 | 0 |
| 0.78125 | 0 |
| 0.7819444444444444 | 0 |
| 0.782638888888889 | 0 |
| 0.7833333333333333 | 0 |
| 0.7840277777777778 | 0 |
| 0.7847222222222222 | 0 |
| 0.7854166666666668 | 0 |
| 0.7861111111111111 | 0 |
| 0.7868055555555555 | 0 |
| 0.7875 | 0 |
| 0.7881944444444445 | 0 |
| 0.7888888888888889 | 0 |
| 0.7895833333333333 | 0 |
| 0.7902777777777777 | 0 |
| 0.7909722222222223 | 0 |
| 0.7916666666666666 | 0 |
| 0.7923611111111111 | 0 |
| 0.7930555555555556 | 0 |
| 0.7937500000000001 | 0 |
| 0.7944444444444444 | 0 |
| 0.7951388888888888 | 0 |
| 0.7958333333333334 | 0 |
| 0.7965277777777778 | 0 |
| 0.7972222222222222 | 0 |
| 0.7979166666666666 | 0 |
| 0.7986111111111112 | 0 |
| 0.7993055555555556 | 0 |
| 0.7999999999999999 | 0 |
| 0.8006944444444444 | 0 |
| 0.8013888888888889 | 0 |
| 0.8020833333333334 | 0 |
| 0.8027777777777777 | 0 |
| 0.8034722222222223 | 0 |
| 0.8041666666666667 | 0 |
| 0.8048611111111111 | 0 |
| 0.8055555555555555 | 0 |
| 0.80625 | 0 |
| 0.8069444444444445 | 0 |
| 0.8076388888888889 | 0 |
| 0.8083333333333332 | 0 |
| 0.8090277777777778 | 0 |
| 0.8097222222222222 | 0 |
| 0.8104166666666667 | 0 |
| 0.811111111111111 | 0 |
| 0.8118055555555556 | 0 |
| 0.8125 | 0 |
| 0.8131944444444444 | 0 |
| 0.813888888888889 | 0 |
| 0.8145833333333333 | 0 |
| 0.8152777777777778 | 0 |
| 0.8159722222222222 | 0 |
| 0.8166666666666668 | 0 |
| 0.8173611111111111 | 0 |
| 0.8180555555555555 | 0 |
| 0.81875 | 0 |
| 0.8194444444444445 | 0 |
| 0.8201388888888889 | 0 |
| 0.8208333333333333 | 0 |
| 0.8215277777777777 | 0 |
| 0.8222222222222223 | 0 |
| 0.8229166666666666 | 0 |
| 0.8236111111111111 | 0 |
| 0.8243055555555556 | 0 |
| 0.8250000000000001 | 0 |
| 0.8256944444444444 | 0 |
| 0.8263888888888888 | 0 |
| 0.8270833333333334 | 0 |
| 0.8277777777777778 | 0 |
| 0.8284722222222222 | 0 |
| 0.8291666666666666 | 0 |
| 0.8298611111111112 | 0 |
| 0.8305555555555556 | 0 |
| 0.8312499999999999 | 0 |
| 0.8319444444444444 | 0 |
| 0.8326388888888889 | 0 |
| 0.8333333333333334 | 0 |
| 0.8340277777777777 | 0 |
| 0.8347222222222223 | 0 |
| 0.8354166666666667 | 0 |
| 0.8361111111111111 | 0 |
| 0.8368055555555555 | 0 |
| 0.8375 | 0 |
| 0.8381944444444445 | 0 |
| 0.8388888888888889 | 0 |
| 0.8395833333333332 | 0 |
| 0.8402777777777778 | 0 |
| 0.8409722222222222 | 0 |
| 0.8416666666666667 | 0 |
| 0.842361111111111 | 0 |
| 0.8430555555555556 | 0 |
| 0.84375 | 0 |
| 0.8444444444444444 | 0 |
| 0.845138888888889 | 0 |
| 0.8458333333333333 | 0 |
| 0.8465277777777778 | 0 |
| 0.8472222222222222 | 0 |
| 0.8479166666666668 | 0 |
| 0.8486111111111111 | 0 |
| 0.8493055555555555 | 0 |
| 0.85 | 0 |
| 0.8506944444444445 | 0 |
| 0.8513888888888889 | 0 |
| 0.8520833333333333 | 0 |
| 0.8527777777777777 | 0 |
| 0.8534722222222223 | 0 |
| 0.8541666666666666 | 0 |
| 0.8548611111111111 | 0 |
| 0.8555555555555556 | 0 |
| 0.8562500000000001 | 0 |
| 0.8569444444444444 | 0 |
| 0.8576388888888888 | 0 |
| 0.8583333333333334 | 0 |
| 0.8590277777777778 | 0 |
| 0.8597222222222222 | 0 |
| 0.8604166666666666 | 0 |
| 0.8611111111111112 | 0 |
| 0.8618055555555556 | 0 |
| 0.8624999999999999 | 0 |
| 0.8631944444444444 | 0 |
| 0.8638888888888889 | 0 |
| 0.8645833333333334 | 0 |
| 0.8652777777777777 | 0 |
| 0.8659722222222223 | 0 |
| 0.8666666666666667 | 0 |
| 0.8673611111111111 | 0 |
| 0.8680555555555555 | 0 |
| 0.86875 | 0 |
| 0.8694444444444445 | 0 |
| 0.8701388888888889 | 0 |
| 0.8708333333333332 | 0 |
| 0.8715277777777778 | 0 |
| 0.8722222222222222 | 0 |
| 0.8729166666666667 | 0 |
| 0.873611111111111 | 0 |
| 0.8743055555555556 | 0 |
| 0.875 | 0 |
| 0.8756944444444444 | 0 |
| 0.876388888888889 | 0 |
| 0.8770833333333333 | 0 |
| 0.8777777777777778 | 0 |
| 0.8784722222222222 | 0 |
| 0.8791666666666668 | 0 |
| 0.8798611111111111 | 0 |
| 0.8805555555555555 | 0 |
| 0.88125 | 0 |
| 0.8819444444444445 | 0 |
| 0.8826388888888889 | 0 |
| 0.8833333333333333 | 0 |
| 0.8840277777777777 | 0 |
| 0.8847222222222223 | 0 |
| 0.8854166666666666 | 0 |
| 0.8861111111111111 | 0 |
| 0.8868055555555556 | 0 |
| 0.8875000000000001 | 0 |
| 0.8881944444444444 | 0 |
| 0.8888888888888888 | 0 |
| 0.8895833333333334 | 0 |
| 0.8902777777777778 | 0 |
| 0.8909722222222222 | 0 |
| 0.8916666666666666 | 0 |
| 0.8923611111111112 | 0 |
| 0.8930555555555556 | 0 |
| 0.8937499999999999 | 0 |
| 0.8944444444444444 | 0 |
| 0.8951388888888889 | 0 |
| 0.8958333333333334 | 0 |
| 0.8965277777777777 | 0 |
| 0.8972222222222223 | 0 |
| 0.8979166666666667 | 0 |
| 0.8986111111111111 | 0 |
| 0.8993055555555555 | 0 |
| 0.9 | 0 |
| 0.9006944444444445 | 0 |
| 0.9013888888888889 | 0 |
| 0.9020833333333332 | 0 |
| 0.9027777777777778 | 0 |
| 0.9034722222222222 | 0 |
| 0.9041666666666667 | 0 |
| 0.904861111111111 | 0 |
| 0.9055555555555556 | 0 |
| 0.90625 | 0 |
| 0.9069444444444444 | 0 |
| 0.907638888888889 | 0 |
| 0.9083333333333333 | 0 |
| 0.9090277777777778 | 0 |
| 0.9097222222222222 | 0 |
| 0.9104166666666668 | 0 |
| 0.9111111111111111 | 0 |
| 0.9118055555555555 | 0 |
| 0.9125 | 0 |
| 0.9131944444444445 | 0 |
| 0.9138888888888889 | 0 |
| 0.9145833333333333 | 0 |
| 0.9152777777777777 | 0 |
| 0.9159722222222223 | 0 |
| 0.9166666666666666 | 0 |
| 0.9173611111111111 | 0 |
| 0.9180555555555556 | 0 |
| 0.9187500000000001 | 0 |
| 0.9194444444444444 | 0 |
| 0.9201388888888888 | 0 |
| 0.9208333333333334 | 0 |
| 0.9215277777777778 | 0 |
| 0.9222222222222222 | 0 |
| 0.9229166666666666 | 0 |
| 0.9236111111111112 | 0 |
| 0.9243055555555556 | 0 |
| 0.9249999999999999 | 0 |
| 0.9256944444444444 | 0 |
| 0.9263888888888889 | 0 |
| 0.9270833333333334 | 0 |
| 0.9277777777777777 | 0 |
| 0.9284722222222223 | 0 |
| 0.9291666666666667 | 0 |
| 0.9298611111111111 | 0 |
| 0.9305555555555555 | 0 |
| 0.93125 | 0 |
| 0.9319444444444445 | 0 |
| 0.9326388888888889 | 0 |
| 0.9333333333333332 | 0 |
| 0.9340277777777778 | 0 |
| 0.9347222222222222 | 0 |
| 0.9354166666666667 | 0 |
| 0.936111111111111 | 0 |
| 0.9368055555555556 | 0 |
| 0.9375 | 0 |
| 0.9381944444444444 | 0 |
| 0.938888888888889 | 0 |
| 0.9395833333333333 | 0 |
| 0.9402777777777778 | 0 |
| 0.9409722222222222 | 0 |
| 0.9416666666666668 | 0 |
| 0.9423611111111111 | 0 |
| 0.9430555555555555 | 0 |
| 0.94375 | 0 |
| 0.9444444444444445 | 0 |
| 0.9451388888888889 | 0 |
| 0.9458333333333333 | 0 |
| 0.9465277777777777 | 0 |
| 0.9472222222222223 | 0 |
| 0.9479166666666666 | 0 |
| 0.9486111111111111 | 0 |
| 0.9493055555555556 | 0 |
| 0.9500000000000001 | 0 |
| 0.9506944444444444 | 0 |
| 0.9513888888888888 | 0 |
| 0.9520833333333334 | 0 |
| 0.9527777777777778 | 0 |
| 0.9534722222222222 | 0 |
| 0.9541666666666666 | 0 |
| 0.9548611111111112 | 0 |
| 0.9555555555555556 | 0 |
| 0.9562499999999999 | 0 |
| 0.9569444444444444 | 0 |
| 0.9576388888888889 | 0 |
| 0.9583333333333334 | 0 |
| 0.9590277777777777 | 0 |
| 0.9597222222222223 | 0 |
| 0.9604166666666667 | 0 |
| 0.9611111111111111 | 0 |
| 0.9618055555555555 | 0 |
| 0.9625 | 0 |
| 0.9631944444444445 | 0 |
| 0.9638888888888889 | 0 |
| 0.9645833333333332 | 0 |
| 0.9652777777777778 | 0 |
| 0.9659722222222222 | 0 |
| 0.9666666666666667 | 0 |
| 0.967361111111111 | 0 |
| 0.9680555555555556 | 0 |
| 0.96875 | 0 |
| 0.9694444444444444 | 0 |
| 0.970138888888889 | 0 |
| 0.9708333333333333 | 0 |
| 0.9715277777777778 | 0 |
| 0.9722222222222222 | 0 |
| 0.9729166666666668 | 0 |
| 0.9736111111111111 | 0 |
| 0.9743055555555555 | 0 |
| 0.975 | 0 |
| 0.9756944444444445 | 0 |
| 0.9763888888888889 | 0 |
| 0.9770833333333333 | 0 |
| 0.9777777777777777 | 0 |
| 0.9784722222222223 | 0 |
| 0.9791666666666666 | 0 |
| 0.9798611111111111 | 0 |
| 0.9805555555555556 | 0 |
| 0.9812500000000001 | 0 |
| 0.9819444444444444 | 0 |
| 0.9826388888888888 | 0 |
| 0.9833333333333334 | 0 |
| 0.9840277777777778 | 0 |
| 0.9847222222222222 | 0 |
| 0.9854166666666666 | 0 |
| 0.9861111111111112 | 0 |
| 0.9868055555555556 | 0 |
| 0.9874999999999999 | 0 |
| 0.9881944444444444 | 0 |
| 0.9888888888888889 | 0 |
| 0.9895833333333334 | 0 |
| 0.9902777777777777 | 0 |
| 0.9909722222222223 | 0 |
| 0.9916666666666667 | 0 |
| 0.9923611111111111 | 0 |
| 0.9930555555555555 | 0 |
| 0.99375 | 0 |
| 0.9944444444444445 | 0 |
| 0.9951388888888889 | 0 |
| 0.9958333333333332 | 0 |
| 0.9965277777777778 | 0 |
| 0.9972222222222222 | 0 |
| 0.9979166666666667 | 0 |
| 0.998611111111111 | 0 |
| 0.9993055555555556 | 0 |